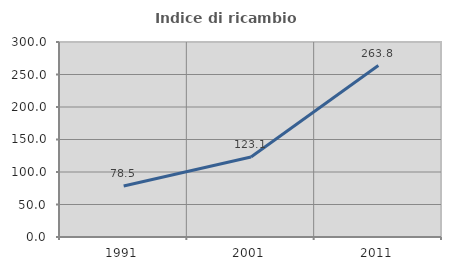
| Category | Indice di ricambio occupazionale  |
|---|---|
| 1991.0 | 78.523 |
| 2001.0 | 123.14 |
| 2011.0 | 263.83 |